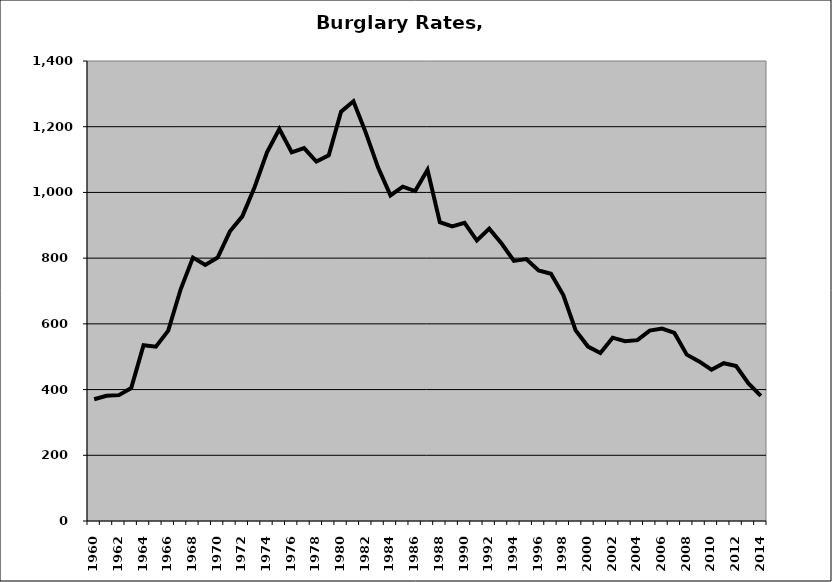
| Category | Burglary |
|---|---|
| 1960.0 | 370.401 |
| 1961.0 | 381.124 |
| 1962.0 | 383.079 |
| 1963.0 | 404.571 |
| 1964.0 | 534.876 |
| 1965.0 | 530.473 |
| 1966.0 | 579.223 |
| 1967.0 | 704.439 |
| 1968.0 | 801.755 |
| 1969.0 | 779.351 |
| 1970.0 | 801.746 |
| 1971.0 | 881.706 |
| 1972.0 | 927.207 |
| 1973.0 | 1016.423 |
| 1974.0 | 1121.751 |
| 1975.0 | 1193.123 |
| 1976.0 | 1122.144 |
| 1977.0 | 1134.667 |
| 1978.0 | 1093.738 |
| 1979.0 | 1112.882 |
| 1980.0 | 1245.976 |
| 1981.0 | 1277.579 |
| 1982.0 | 1182.071 |
| 1983.0 | 1075.555 |
| 1984.0 | 990.918 |
| 1985.0 | 1017.482 |
| 1986.0 | 1004.248 |
| 1987.0 | 1068.865 |
| 1988.0 | 909.591 |
| 1989.0 | 896.899 |
| 1990.0 | 907.202 |
| 1991.0 | 853.61 |
| 1992.0 | 889.71 |
| 1993.0 | 844.521 |
| 1994.0 | 791.701 |
| 1995.0 | 797.31 |
| 1996.0 | 762.452 |
| 1997.0 | 752.561 |
| 1998.0 | 687.534 |
| 1999.0 | 580.169 |
| 2000.0 | 530.869 |
| 2001.0 | 511.502 |
| 2002.0 | 557.914 |
| 2003.0 | 546.94 |
| 2004.0 | 550.334 |
| 2005.0 | 579.628 |
| 2006.0 | 585.648 |
| 2007.0 | 572.493 |
| 2008.0 | 506.312 |
| 2009.0 | 485.738 |
| 2010.0 | 460.319 |
| 2011.0 | 480.261 |
| 2012.0 | 471.741 |
| 2013.0 | 418.9 |
| 2014.0 | 380.655 |